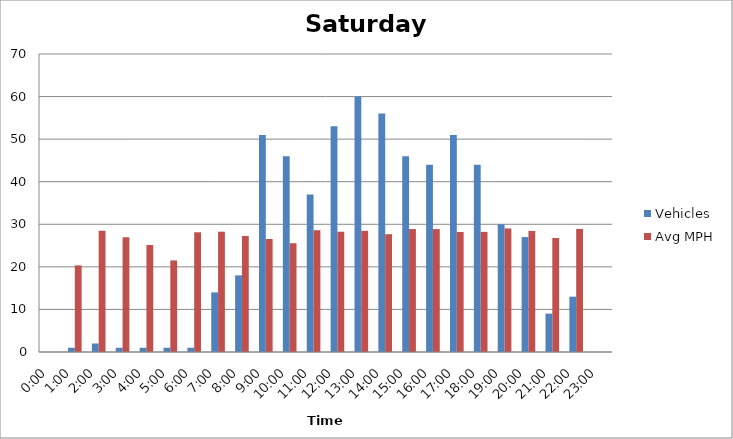
| Category | Vehicles | Avg MPH |
|---|---|---|
| 0:00 | 0 | 0 |
| 1:00 | 1 | 20.35 |
| 2:00 | 2 | 28.49 |
| 3:00 | 1 | 26.95 |
| 4:00 | 1 | 25.14 |
| 5:00 | 1 | 21.51 |
| 6:00 | 1 | 28.12 |
| 7:00 | 14 | 28.26 |
| 8:00 | 18 | 27.26 |
| 9:00 | 51 | 26.55 |
| 10:00 | 46 | 25.55 |
| 11:00 | 37 | 28.61 |
| 12:00 | 53 | 28.25 |
| 13:00 | 60 | 28.47 |
| 14:00 | 56 | 27.67 |
| 15:00 | 46 | 28.88 |
| 16:00 | 44 | 28.88 |
| 17:00 | 51 | 28.2 |
| 18:00 | 44 | 28.22 |
| 19:00 | 30 | 29.02 |
| 20:00 | 27 | 28.44 |
| 21:00 | 9 | 26.78 |
| 22:00 | 13 | 28.91 |
| 23:00 | 0 | 0 |